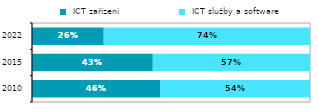
| Category |  ICT zařízení |  ICT služby a software |
|---|---|---|
| 2010.0 | 0.462 | 0.538 |
| 2015.0 | 0.435 | 0.565 |
| 2022.0 | 0.258 | 0.742 |